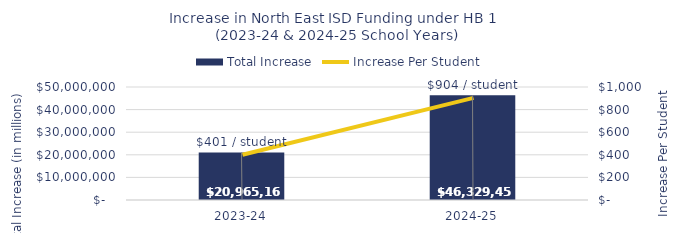
| Category | Total Increase |
|---|---|
| 2023-24 | 20965164 |
| 2024-25 | 46329458 |